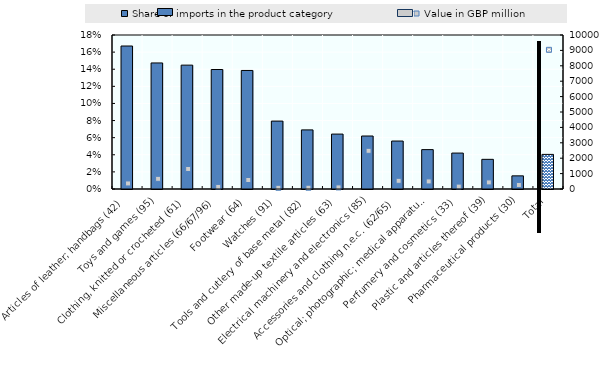
| Category | Share of imports in the product category |
|---|---|
| Articles of leather; handbags (42) | 0.167 |
| Toys and games (95) | 0.147 |
| Clothing, knitted or crocheted (61) | 0.145 |
| Miscellaneous articles (66/67/96) | 0.14 |
| Footwear (64) | 0.139 |
| Watches (91) | 0.079 |
| Tools and cutlery of base metal (82) | 0.069 |
| Other made-up textile articles (63) | 0.064 |
| Electrical machinery and electronics (85) | 0.062 |
| Accessories and clothing n.e.c. (62/65) | 0.056 |
| Optical; photographic; medical apparatus (90) | 0.046 |
| Perfumery and cosmetics (33) | 0.042 |
| Plastic and articles thereof (39) | 0.035 |
| Pharmaceutical products (30) | 0.015 |
| Total | 0.04 |